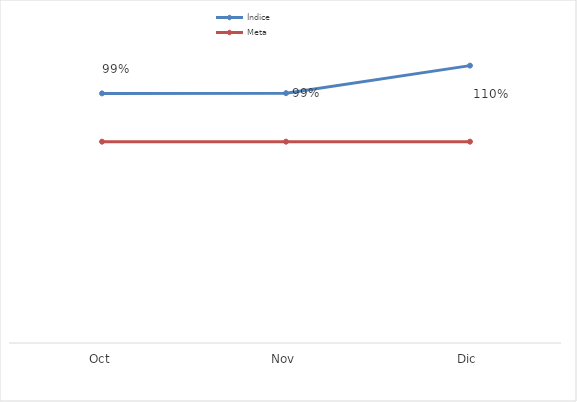
| Category | Índice | Meta |
|---|---|---|
| Oct | 0.992 | 0.8 |
| Nov | 0.993 | 0.8 |
| Dic | 1.102 | 0.8 |